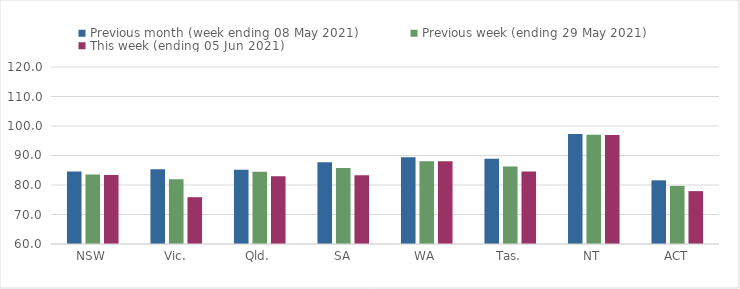
| Category | Previous month (week ending 08 May 2021) | Previous week (ending 29 May 2021) | This week (ending 05 Jun 2021) |
|---|---|---|---|
| NSW | 84.54 | 83.52 | 83.37 |
| Vic. | 85.3 | 81.96 | 75.87 |
| Qld. | 85.13 | 84.53 | 82.93 |
| SA | 87.75 | 85.75 | 83.33 |
| WA | 89.39 | 88.03 | 88.03 |
| Tas. | 88.9 | 86.27 | 84.54 |
| NT | 97.29 | 97.01 | 96.98 |
| ACT | 81.59 | 79.69 | 77.92 |